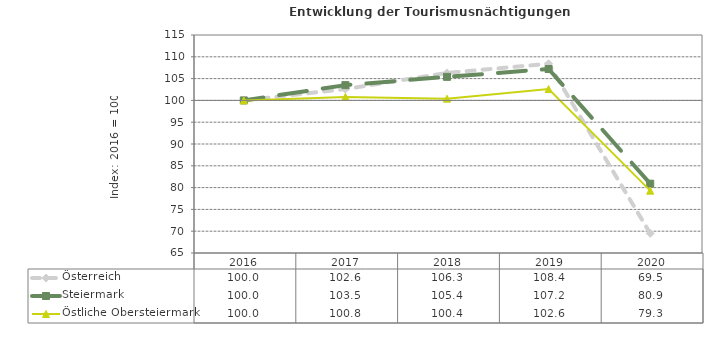
| Category | Österreich | Steiermark | Östliche Obersteiermark |
|---|---|---|---|
| 2020.0 | 69.5 | 80.9 | 79.3 |
| 2019.0 | 108.4 | 107.2 | 102.6 |
| 2018.0 | 106.3 | 105.4 | 100.4 |
| 2017.0 | 102.6 | 103.5 | 100.8 |
| 2016.0 | 100 | 100 | 100 |